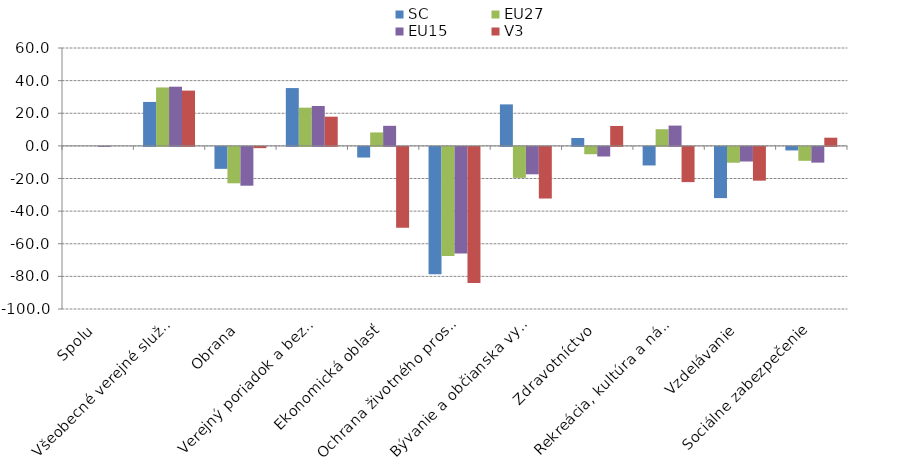
| Category | SC | EU27 | EU15 | V3 |
|---|---|---|---|---|
| Spolu | 0 | 0 | 0 | 0 |
| Všeobecné verejné služby | 26.936 | 35.817 | 36.277 | 33.891 |
| Obrana | -13.473 | -22.337 | -23.803 | -0.773 |
| Verejný poriadok a bezpečnosť | 35.445 | 23.427 | 24.445 | 17.891 |
| Ekonomická oblasť  | -6.539 | 8.236 | 12.296 | -49.53 |
| Ochrana životného prostredia | -78.023 | -66.857 | -65.366 | -83.404 |
| Bývanie a občianska vybavenosť  | 25.433 | -19.014 | -16.806 | -31.66 |
| Zdravotníctvo | 4.84 | -4.504 | -5.898 | 12.209 |
| Rekreácia, kultúra a náboženstvo | -11.39 | 10.218 | 12.44 | -21.594 |
| Vzdelávanie | -31.4 | -9.718 | -8.966 | -20.715 |
| Sociálne zabezpečenie  | -2.185 | -8.552 | -9.666 | 5.017 |